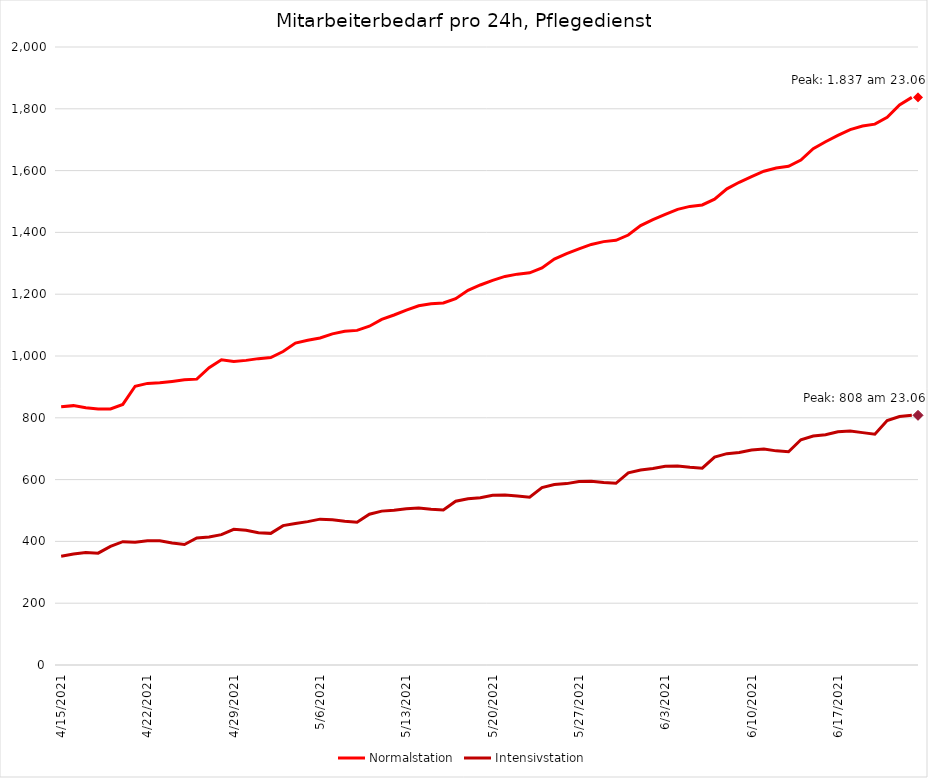
| Category | Normalstation | Intensivstation |
|---|---|---|
| 4/15/21 | 835.467 | 352 |
| 4/16/21 | 839.367 | 359 |
| 4/17/21 | 832.867 | 364 |
| 4/18/21 | 828.533 | 362 |
| 4/19/21 | 828.533 | 384 |
| 4/20/21 | 843.267 | 399 |
| 4/21/21 | 902.2 | 397 |
| 4/22/21 | 911.3 | 402 |
| 4/23/21 | 913.467 | 402 |
| 4/24/21 | 917.8 | 395 |
| 4/25/21 | 923 | 390 |
| 4/26/21 | 925.167 | 411 |
| 4/27/21 | 962 | 414 |
| 4/28/21 | 988 | 422 |
| 4/29/21 | 982.367 | 439 |
| 4/30/21 | 985.833 | 436 |
| 5/1/21 | 991.467 | 428 |
| 5/2/21 | 994.933 | 426 |
| 5/3/21 | 1014.433 | 451 |
| 5/4/21 | 1041.733 | 458 |
| 5/5/21 | 1050.833 | 464 |
| 5/6/21 | 1058.2 | 472 |
| 5/7/21 | 1071.633 | 470 |
| 5/8/21 | 1079.867 | 465 |
| 5/9/21 | 1082.9 | 462 |
| 5/10/21 | 1096.333 | 488 |
| 5/11/21 | 1118.433 | 498 |
| 5/12/21 | 1132.733 | 501 |
| 5/13/21 | 1148.767 | 506 |
| 5/14/21 | 1162.633 | 508 |
| 5/15/21 | 1169.133 | 504 |
| 5/16/21 | 1171.733 | 502 |
| 5/17/21 | 1185.6 | 530 |
| 5/18/21 | 1212.467 | 538 |
| 5/19/21 | 1229.8 | 541 |
| 5/20/21 | 1244.533 | 549 |
| 5/21/21 | 1257.533 | 550 |
| 5/22/21 | 1264.9 | 547 |
| 5/23/21 | 1269.233 | 543 |
| 5/24/21 | 1285.267 | 574 |
| 5/25/21 | 1313.867 | 584 |
| 5/26/21 | 1331.2 | 587 |
| 5/27/21 | 1346.367 | 594 |
| 5/28/21 | 1361.1 | 595 |
| 5/29/21 | 1370.2 | 591 |
| 5/30/21 | 1374.533 | 588 |
| 5/31/21 | 1391.433 | 622 |
| 6/1/21 | 1422.2 | 631 |
| 6/2/21 | 1441.267 | 636 |
| 6/3/21 | 1458.167 | 643 |
| 6/4/21 | 1474.633 | 644 |
| 6/5/21 | 1484.167 | 640 |
| 6/6/21 | 1488.933 | 637 |
| 6/7/21 | 1507.567 | 673 |
| 6/8/21 | 1540.933 | 684 |
| 6/9/21 | 1562.167 | 688 |
| 6/10/21 | 1580.367 | 696 |
| 6/11/21 | 1598.133 | 699 |
| 6/12/21 | 1608.533 | 693 |
| 6/13/21 | 1613.733 | 690 |
| 6/14/21 | 1634.1 | 729 |
| 6/15/21 | 1670.933 | 741 |
| 6/16/21 | 1693.467 | 745 |
| 6/17/21 | 1713.833 | 755 |
| 6/18/21 | 1732.9 | 757 |
| 6/19/21 | 1744.167 | 752 |
| 6/20/21 | 1750.233 | 747 |
| 6/21/21 | 1772.333 | 791 |
| 6/22/21 | 1812.2 | 804 |
| 6/23/21 | 1836.9 | 808 |